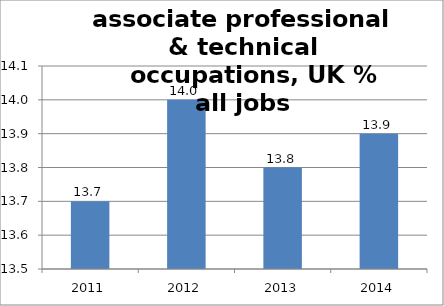
| Category | 3: Associate prof. & tech. |
|---|---|
| 2011.0 | 13.7 |
| 2012.0 | 14 |
| 2013.0 | 13.8 |
| 2014.0 | 13.9 |